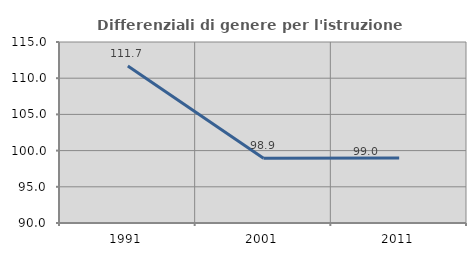
| Category | Differenziali di genere per l'istruzione superiore |
|---|---|
| 1991.0 | 111.673 |
| 2001.0 | 98.942 |
| 2011.0 | 98.97 |